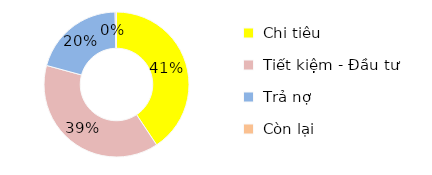
| Category | Series 0 |
|---|---|
| Chi tiêu | 102610 |
| Tiết kiệm - Đầu tư | 97300 |
| Trả nợ | 51620 |
| Còn lại | 770 |